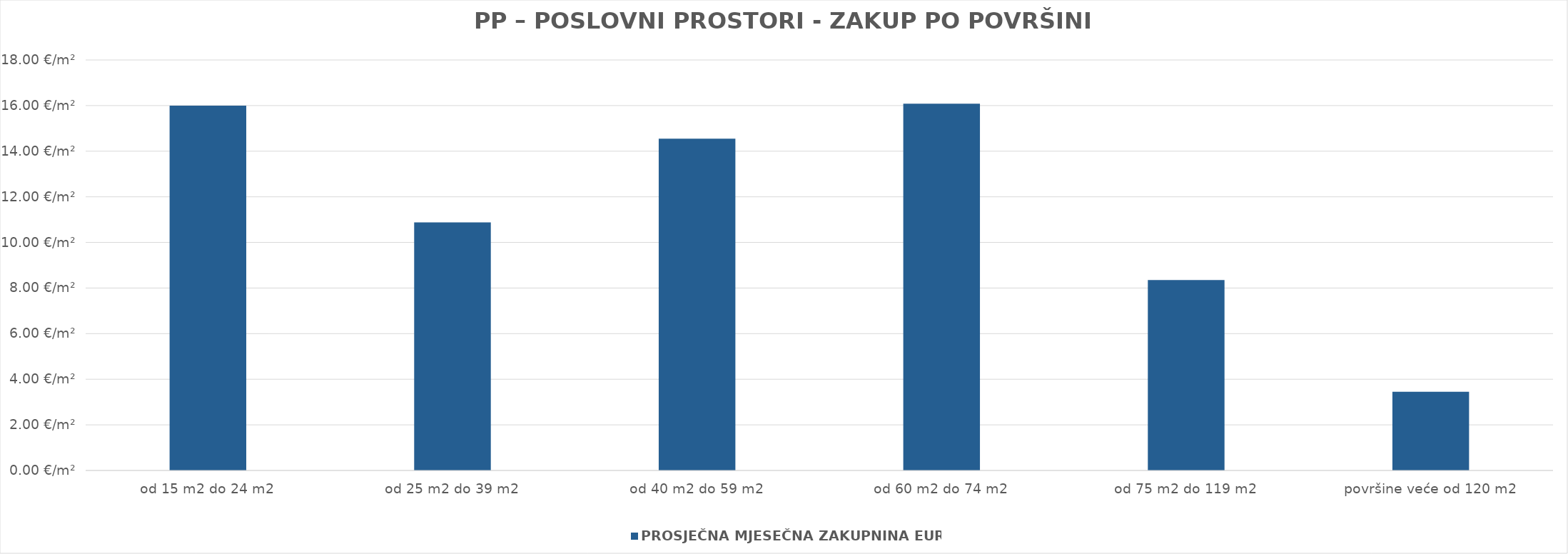
| Category | PROSJEČNA MJESEČNA ZAKUPNINA EUR/m2 |
|---|---|
| od 15 m2 do 24 m2 | 1900-01-15 23:55:16 |
| od 25 m2 do 39 m2 | 1900-01-10 21:03:10 |
| od 40 m2 do 59 m2 | 1900-01-14 13:08:50 |
| od 60 m2 do 74 m2 | 1900-01-16 01:59:54 |
| od 75 m2 do 119 m2 | 1900-01-08 08:22:49 |
| površine veće od 120 m2 | 1900-01-03 10:52:17 |